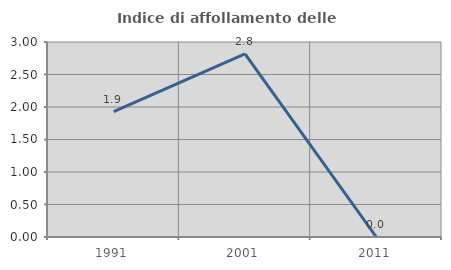
| Category | Indice di affollamento delle abitazioni  |
|---|---|
| 1991.0 | 1.928 |
| 2001.0 | 2.817 |
| 2011.0 | 0 |